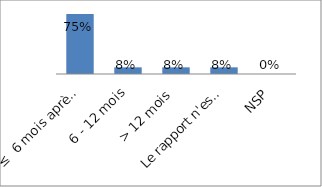
| Category | Series 0 |
|---|---|
| ≤  6 mois après la fin de l'année budgétaire | 0.75 |
| 6 - 12 mois | 0.083 |
| > 12 mois | 0.083 |
| Le rapport n'est pas publié | 0.083 |
| NSP | 0 |